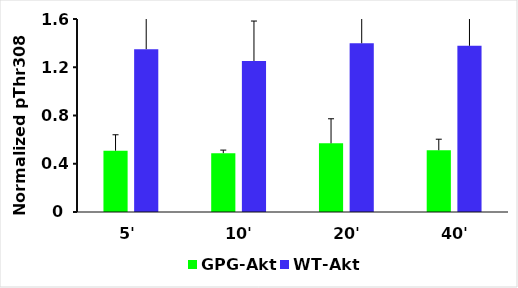
| Category | GPG-Akt | WT-Akt |
|---|---|---|
| 5' | 0.508 | 1.35 |
| 10' | 0.488 | 1.252 |
| 20' | 0.569 | 1.399 |
| 40' | 0.512 | 1.378 |